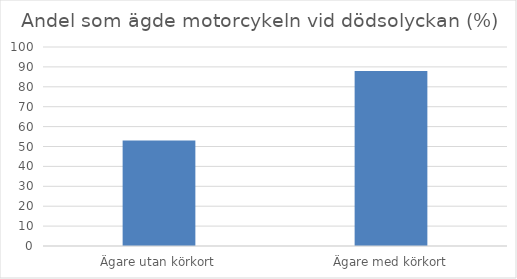
| Category | Andel % |
|---|---|
| Ägare utan körkort | 53 |
| Ägare med körkort | 88 |